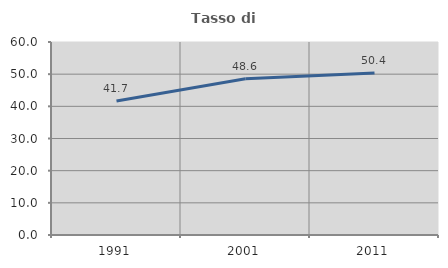
| Category | Tasso di occupazione   |
|---|---|
| 1991.0 | 41.684 |
| 2001.0 | 48.563 |
| 2011.0 | 50.392 |